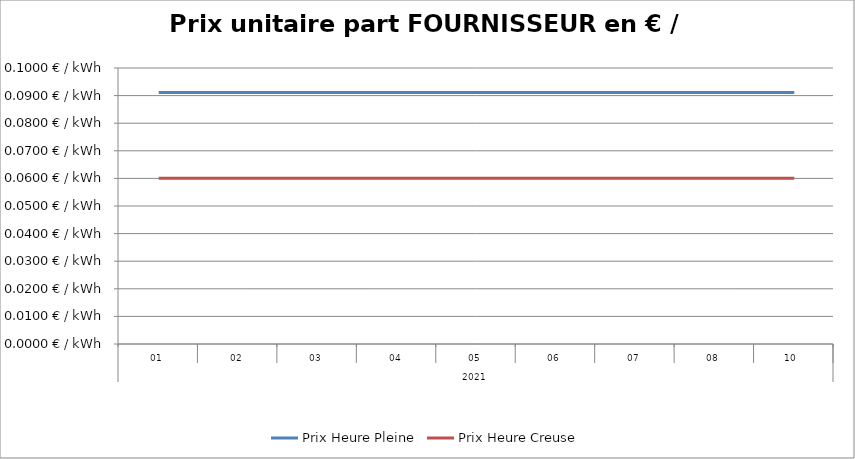
| Category | Prix Heure Pleine | Prix Heure Creuse |
|---|---|---|
| 0 | 0.091 | 0.06 |
| 1 | 0.091 | 0.06 |
| 2 | 0.091 | 0.06 |
| 3 | 0.091 | 0.06 |
| 4 | 0.091 | 0.06 |
| 5 | 0.091 | 0.06 |
| 6 | 0.091 | 0.06 |
| 7 | 0.091 | 0.06 |
| 8 | 0.091 | 0.06 |